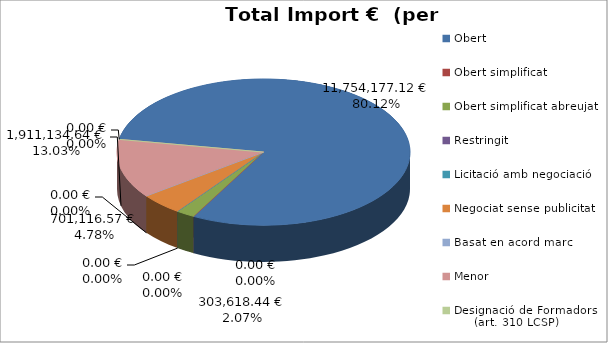
| Category | Total preu              (amb iva) |
|---|---|
| Obert | 11754177.12 |
| Obert simplificat | 0 |
| Obert simplificat abreujat | 303618.44 |
| Restringit | 0 |
| Licitació amb negociació | 0 |
| Negociat sense publicitat | 701116.57 |
| Basat en acord marc | 0 |
| Menor | 1911134.64 |
| Designació de Formadors
     (art. 310 LCSP) | 0 |